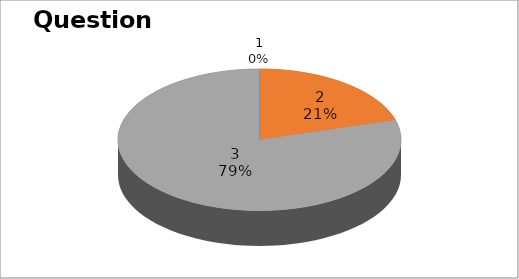
| Category | Series 0 |
|---|---|
| 0 | 0 |
| 1 | 8 |
| 2 | 31 |